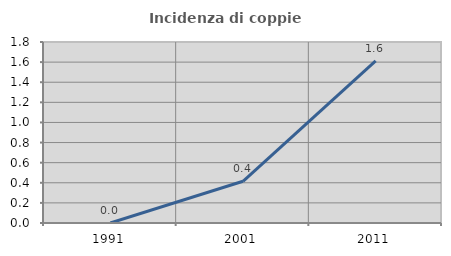
| Category | Incidenza di coppie miste |
|---|---|
| 1991.0 | 0 |
| 2001.0 | 0.415 |
| 2011.0 | 1.613 |